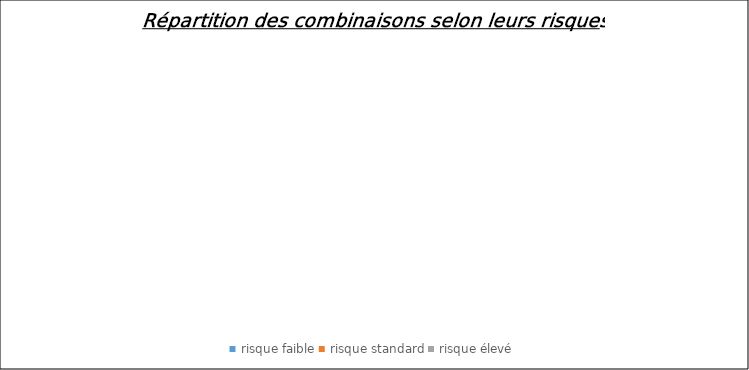
| Category | Series 0 |
|---|---|
| risque faible | 0 |
| risque standard | 0 |
| risque élevé | 0 |